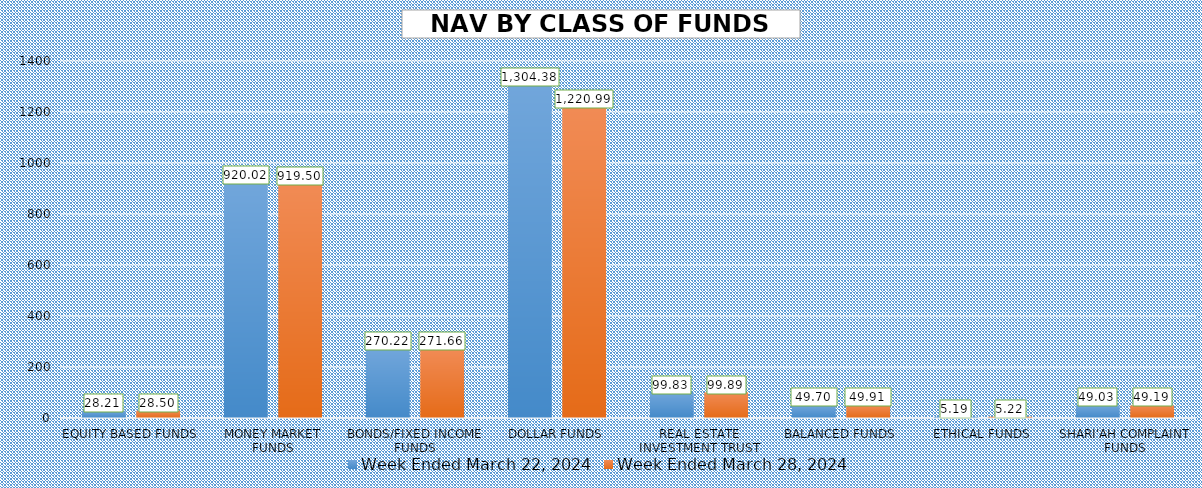
| Category | Week Ended March 22, 2024 | Week Ended March 28, 2024 |
|---|---|---|
| EQUITY BASED FUNDS | 28.215 | 28.5 |
| MONEY MARKET FUNDS | 920.024 | 919.496 |
| BONDS/FIXED INCOME FUNDS | 270.221 | 271.659 |
| DOLLAR FUNDS | 1304.384 | 1220.986 |
| REAL ESTATE INVESTMENT TRUST | 99.828 | 99.892 |
| BALANCED FUNDS | 49.695 | 49.905 |
| ETHICAL FUNDS | 5.194 | 5.216 |
| SHARI'AH COMPLAINT FUNDS | 49.029 | 49.193 |